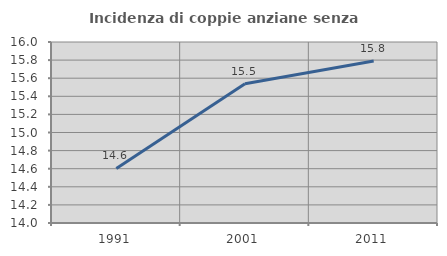
| Category | Incidenza di coppie anziane senza figli  |
|---|---|
| 1991.0 | 14.603 |
| 2001.0 | 15.539 |
| 2011.0 | 15.789 |